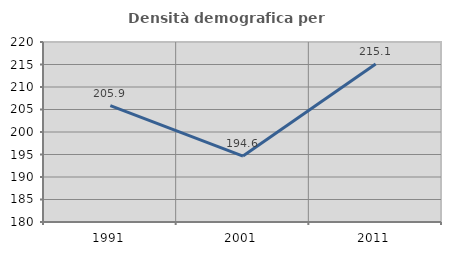
| Category | Densità demografica |
|---|---|
| 1991.0 | 205.862 |
| 2001.0 | 194.643 |
| 2011.0 | 215.117 |